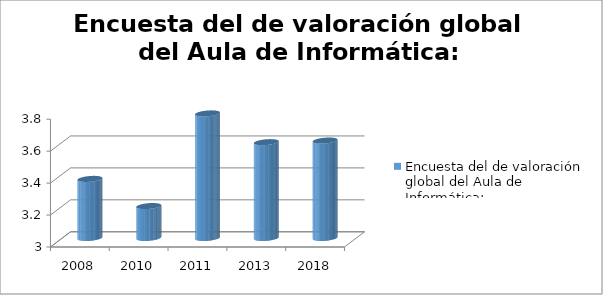
| Category | Encuesta del de valoración global del Aula de Informática: |
|---|---|
| 2008.0 | 3.37 |
| 2010.0 | 3.2 |
| 2011.0 | 3.78 |
| 2013.0 | 3.6 |
| 2018.0 | 3.61 |